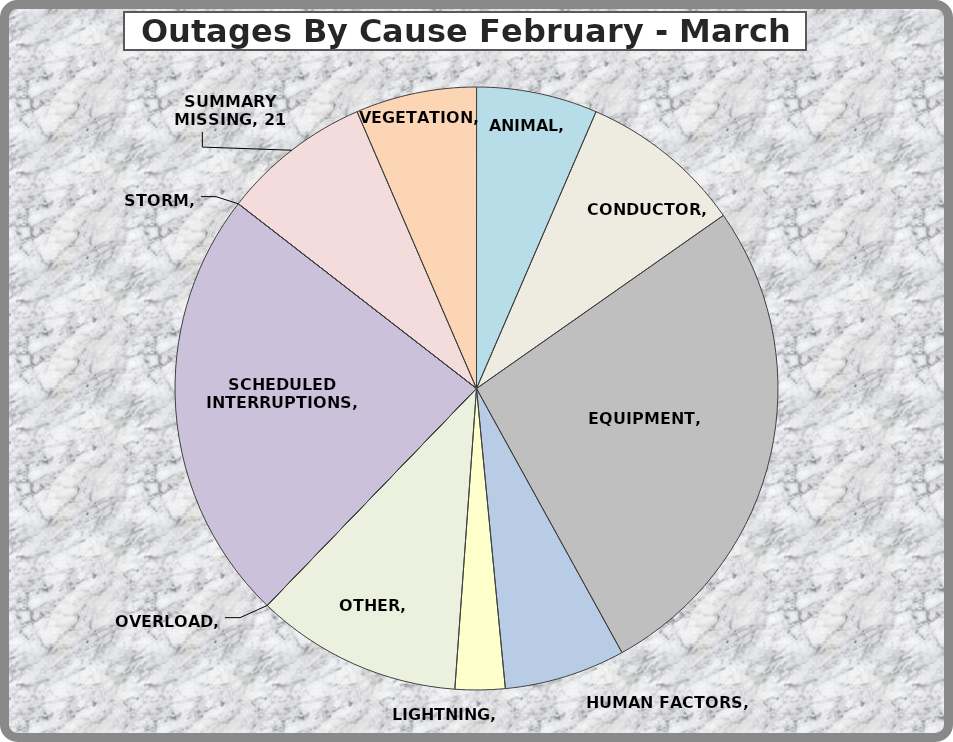
| Category | Series 0 |
|---|---|
| ANIMAL | 17 |
| CONDUCTOR | 23 |
| EQUIPMENT | 70 |
| HUMAN FACTORS | 17 |
| LIGHTNING | 7 |
| OTHER | 29 |
| OVERLOAD | 0 |
| SCHEDULED INTERRUPTIONS | 61 |
| STORM | 0 |
| SUMMARY MISSING | 21 |
| VEGETATION | 17 |